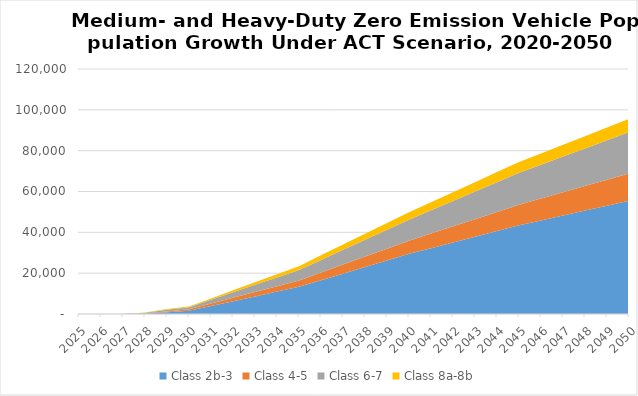
| Category | Class 2b-3 | Class 4-5 | Class 6-7 | Class 8a-8b |
|---|---|---|---|---|
| 2025.0 | 0 | 0 | 0 | 0 |
| 2026.0 | 0 | 0 | 0 | 0 |
| 2027.0 | 0 | 15.932 | 24.412 | 10.384 |
| 2028.0 | 184.652 | 151.125 | 244.635 | 103.892 |
| 2029.0 | 817.123 | 460.127 | 746.114 | 413.824 |
| 2030.0 | 1600 | 670 | 1080 | 350 |
| 2031.0 | 3940 | 1166 | 1886 | 656 |
| 2032.0 | 6280 | 1662 | 2692 | 962 |
| 2033.0 | 8620 | 2158 | 3498 | 1268 |
| 2034.0 | 10960 | 2654 | 4304 | 1574 |
| 2035.0 | 13300 | 3150 | 5110 | 1880 |
| 2036.0 | 16534 | 3808 | 6144 | 2236 |
| 2037.0 | 19768 | 4466 | 7178 | 2592 |
| 2038.0 | 23002 | 5124 | 8212 | 2948 |
| 2039.0 | 26236 | 5782 | 9246 | 3304 |
| 2040.0 | 29470 | 6440 | 10280 | 3660 |
| 2041.0 | 32260 | 7158 | 11362 | 3982 |
| 2042.0 | 35050 | 7876 | 12444 | 4304 |
| 2043.0 | 37840 | 8594 | 13526 | 4626 |
| 2044.0 | 40630 | 9312 | 14608 | 4948 |
| 2045.0 | 43420 | 10030 | 15690 | 5270 |
| 2046.0 | 45826 | 10698 | 16606 | 5516 |
| 2047.0 | 48232 | 11366 | 17522 | 5762 |
| 2048.0 | 50638 | 12034 | 18438 | 6008 |
| 2049.0 | 53044 | 12702 | 19354 | 6254 |
| 2050.0 | 55450 | 13370 | 20270 | 6500 |